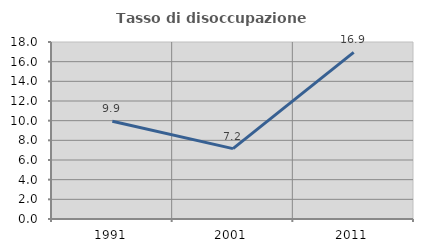
| Category | Tasso di disoccupazione giovanile  |
|---|---|
| 1991.0 | 9.937 |
| 2001.0 | 7.16 |
| 2011.0 | 16.949 |